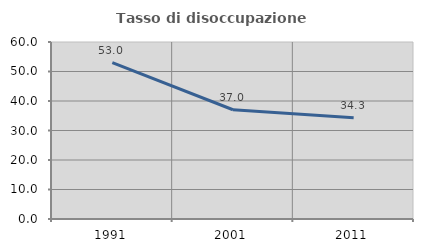
| Category | Tasso di disoccupazione giovanile  |
|---|---|
| 1991.0 | 52.985 |
| 2001.0 | 37.037 |
| 2011.0 | 34.286 |